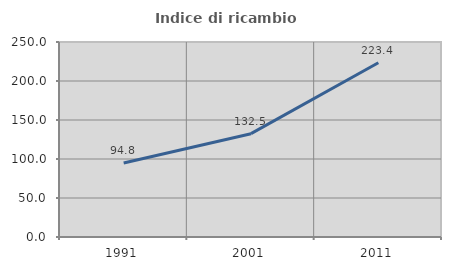
| Category | Indice di ricambio occupazionale  |
|---|---|
| 1991.0 | 94.811 |
| 2001.0 | 132.474 |
| 2011.0 | 223.448 |